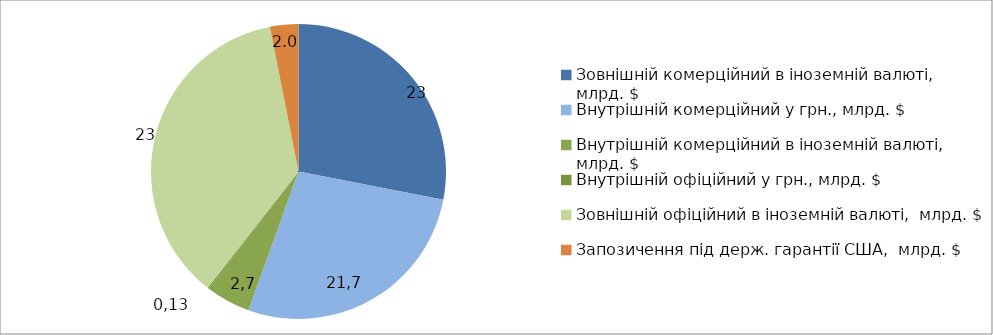
| Category | Series 0 |
|---|---|
| Зовнішній комерційний в іноземній валюті,  млрд. $ | 18.053 |
| Внутрішній комерційний у грн., млрд. $ | 17.673 |
| Внутрішній комерційний в іноземній валюті,  млрд. $ | 3.13 |
| Внутрішній офіційний у грн., млрд. $ | 0.098 |
| Зовнішній офіційний в іноземній валюті,  млрд. $ | 23.395 |
| Запозичення під держ. гарантії США,  млрд. $ | 2 |